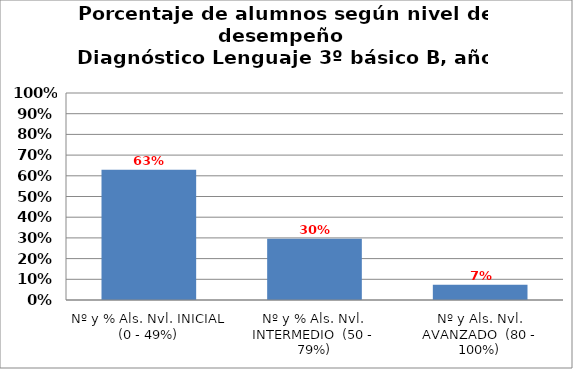
| Category | Series 0 |
|---|---|
| Nº y % Als. Nvl. INICIAL (0 - 49%) | 0.63 |
| Nº y % Als. Nvl. INTERMEDIO  (50 - 79%) | 0.296 |
| Nº y Als. Nvl. AVANZADO  (80 - 100%) | 0.074 |